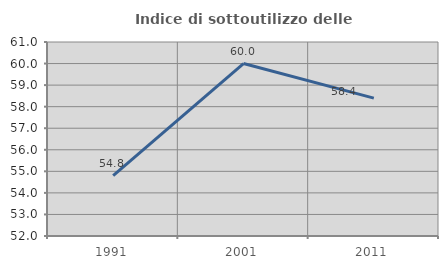
| Category | Indice di sottoutilizzo delle abitazioni  |
|---|---|
| 1991.0 | 54.8 |
| 2001.0 | 60 |
| 2011.0 | 58.397 |